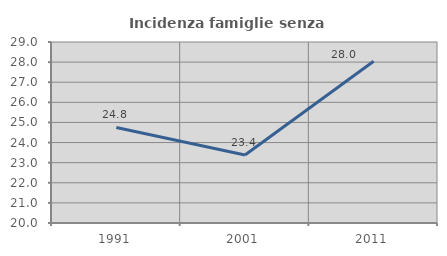
| Category | Incidenza famiglie senza nuclei |
|---|---|
| 1991.0 | 24.752 |
| 2001.0 | 23.385 |
| 2011.0 | 28.045 |